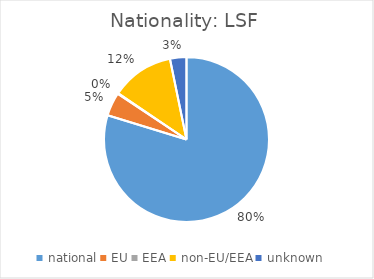
| Category | Nationality: LSF |
|---|---|
| national | 0.797 |
| EU | 0.046 |
| EEA | 0.001 |
| non-EU/EEA | 0.123 |
| unknown | 0.032 |